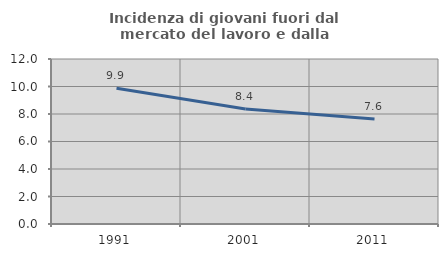
| Category | Incidenza di giovani fuori dal mercato del lavoro e dalla formazione  |
|---|---|
| 1991.0 | 9.879 |
| 2001.0 | 8.364 |
| 2011.0 | 7.642 |